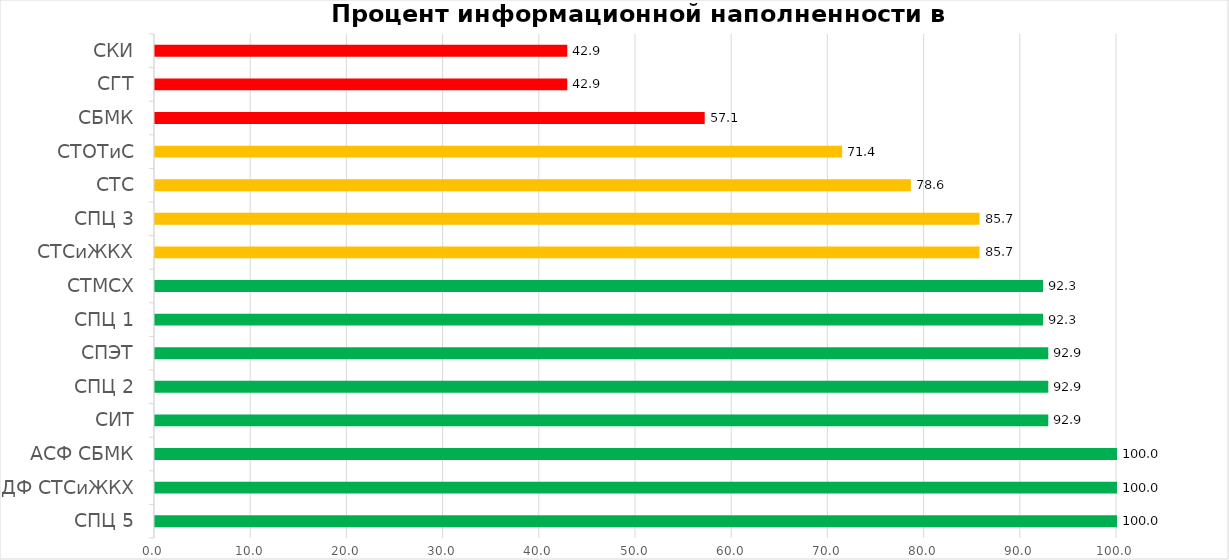
| Category | Series 0 |
|---|---|
| СПЦ 5 | 100 |
| ДФ СТСиЖКХ | 100 |
| АСФ СБМК | 100 |
| СИТ | 92.857 |
| СПЦ 2 | 92.857 |
| СПЭТ | 92.857 |
| СПЦ 1 | 92.308 |
| СТМСХ | 92.308 |
| СТСиЖКХ | 85.714 |
| СПЦ 3 | 85.714 |
| СТС | 78.571 |
| СТОТиС | 71.429 |
| СБМК | 57.143 |
| СГТ | 42.857 |
| СКИ | 42.857 |